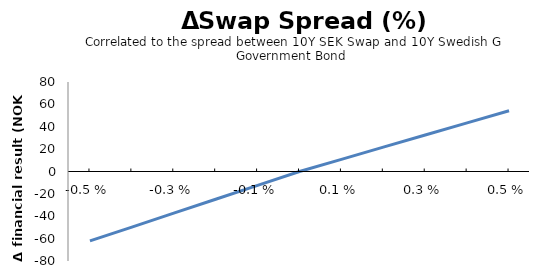
| Category | Series 0 |
|---|---|
| -0.005 | -62.078 |
| -0.004 | -49.662 |
| -0.003 | -37.247 |
| -0.002 | -24.831 |
| -0.001 | -12.416 |
| 0.0 | 0 |
| 0.001 | 10.869 |
| 0.002 | 21.737 |
| 0.003 | 32.606 |
| 0.004 | 43.475 |
| 0.005 | 54.343 |